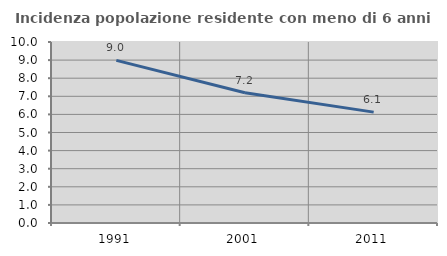
| Category | Incidenza popolazione residente con meno di 6 anni |
|---|---|
| 1991.0 | 8.984 |
| 2001.0 | 7.198 |
| 2011.0 | 6.125 |